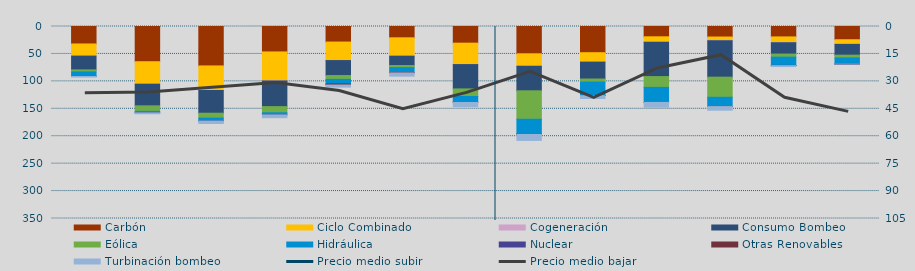
| Category | Carbón | Ciclo Combinado | Cogeneración | Consumo Bombeo | Eólica | Hidráulica | Nuclear | Otras Renovables | Turbinación bombeo |
|---|---|---|---|---|---|---|---|---|---|
| J | 31856.5 | 21784.2 | 332.6 | 25120.8 | 3742.7 | 7869.8 | 320 | 0 | 1244.9 |
| J | 64224.4 | 40730.5 | 223.6 | 39459.7 | 10048.7 | 2606.4 | 130 | 0 | 1680.4 |
| A | 71875.8 | 44407.8 | 356.8 | 41443.4 | 8916.4 | 5181.1 | 179.2 | 0 | 4517 |
| S | 46377.5 | 52485.1 | 420.2 | 46799.1 | 11262.5 | 3698.4 | 178.3 | 0 | 4969.7 |
| O | 28352.7 | 33701.8 | 72.5 | 27285.6 | 6968.9 | 8057.2 | 1524.1 | 736.2 | 3817.1 |
| N | 20637.7 | 33409.3 | 40.8 | 17072.8 | 3847.5 | 8820.4 | 0 | 757.7 | 5932.4 |
| D | 30371.3 | 38818.7 | 239.5 | 44331.3 | 13873.3 | 10280.7 | 108.3 | 133.8 | 8046.3 |
| E | 49749 | 21689 | 1091.7 | 44705.2 | 51833.3 | 26560.6 | 159.6 | 521.7 | 11348.4 |
| F | 47780.9 | 17066.1 | 83.8 | 30784 | 5603.4 | 24359.1 | 40 | 286.6 | 5220.7 |
| M | 18764.1 | 9673.8 | 444.5 | 62414.7 | 19679.2 | 27422.5 | 0 | 20.9 | 8766.8 |
| A | 19179.5 | 6106.3 | 488.3 | 66560.4 | 36687.3 | 16841.6 | 0 | 122 | 6609.5 |
| M | 18994.1 | 10277 | 353.4 | 20633.9 | 5611.8 | 15058.8 | 96.2 | 322.7 | 1709.2 |
| J | 24116.3 | 8196.7 | 265.7 | 19665.3 | 5033.9 | 11035.4 | 68.9 | 6.7 | 99.1 |